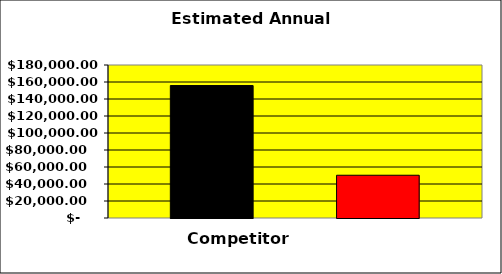
| Category | Series 0 | Series 1 | Series 2 |
|---|---|---|---|
| 0 | 155828.125 |  | 50312.5 |